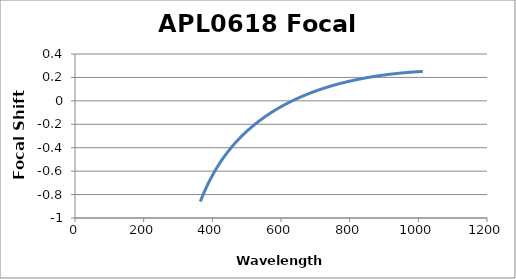
| Category | Focal Shift (mm) |
|---|---|
| 365.0 | -0.86 |
| 366.0 | -0.852 |
| 367.0 | -0.845 |
| 368.0 | -0.838 |
| 369.0 | -0.83 |
| 370.0 | -0.823 |
| 371.0 | -0.816 |
| 372.0 | -0.809 |
| 373.0 | -0.802 |
| 374.0 | -0.795 |
| 375.0 | -0.788 |
| 376.0 | -0.782 |
| 377.0 | -0.775 |
| 378.0 | -0.768 |
| 379.0 | -0.762 |
| 380.0 | -0.755 |
| 381.0 | -0.749 |
| 382.0 | -0.743 |
| 383.0 | -0.736 |
| 384.0 | -0.73 |
| 385.0 | -0.724 |
| 386.0 | -0.718 |
| 387.0 | -0.712 |
| 388.0 | -0.706 |
| 389.0 | -0.7 |
| 390.0 | -0.694 |
| 391.0 | -0.688 |
| 392.0 | -0.682 |
| 393.0 | -0.676 |
| 394.0 | -0.671 |
| 395.0 | -0.665 |
| 396.0 | -0.66 |
| 397.0 | -0.654 |
| 398.0 | -0.649 |
| 399.0 | -0.643 |
| 400.0 | -0.638 |
| 401.0 | -0.632 |
| 402.0 | -0.627 |
| 403.0 | -0.622 |
| 404.0 | -0.617 |
| 405.0 | -0.611 |
| 406.0 | -0.606 |
| 407.0 | -0.601 |
| 408.0 | -0.596 |
| 409.0 | -0.591 |
| 410.0 | -0.586 |
| 411.0 | -0.581 |
| 412.0 | -0.577 |
| 413.0 | -0.572 |
| 414.0 | -0.567 |
| 415.0 | -0.562 |
| 416.0 | -0.557 |
| 417.0 | -0.553 |
| 418.0 | -0.548 |
| 419.0 | -0.544 |
| 420.0 | -0.539 |
| 421.0 | -0.534 |
| 422.0 | -0.53 |
| 423.0 | -0.525 |
| 424.0 | -0.521 |
| 425.0 | -0.517 |
| 426.0 | -0.512 |
| 427.0 | -0.508 |
| 428.0 | -0.504 |
| 429.0 | -0.499 |
| 430.0 | -0.495 |
| 431.0 | -0.491 |
| 432.0 | -0.487 |
| 433.0 | -0.483 |
| 434.0 | -0.479 |
| 435.0 | -0.475 |
| 436.0 | -0.471 |
| 437.0 | -0.467 |
| 438.0 | -0.463 |
| 439.0 | -0.459 |
| 440.0 | -0.455 |
| 441.0 | -0.451 |
| 442.0 | -0.447 |
| 443.0 | -0.443 |
| 444.0 | -0.439 |
| 445.0 | -0.436 |
| 446.0 | -0.432 |
| 447.0 | -0.428 |
| 448.0 | -0.424 |
| 449.0 | -0.421 |
| 450.0 | -0.417 |
| 451.0 | -0.413 |
| 452.0 | -0.41 |
| 453.0 | -0.406 |
| 454.0 | -0.403 |
| 455.0 | -0.399 |
| 456.0 | -0.396 |
| 457.0 | -0.392 |
| 458.0 | -0.389 |
| 459.0 | -0.385 |
| 460.0 | -0.382 |
| 461.0 | -0.378 |
| 462.0 | -0.375 |
| 463.0 | -0.372 |
| 464.0 | -0.368 |
| 465.0 | -0.365 |
| 466.0 | -0.362 |
| 467.0 | -0.358 |
| 468.0 | -0.355 |
| 469.0 | -0.352 |
| 470.0 | -0.349 |
| 471.0 | -0.345 |
| 472.0 | -0.342 |
| 473.0 | -0.339 |
| 474.0 | -0.336 |
| 475.0 | -0.333 |
| 476.0 | -0.33 |
| 477.0 | -0.327 |
| 478.0 | -0.324 |
| 479.0 | -0.321 |
| 480.0 | -0.318 |
| 481.0 | -0.315 |
| 482.0 | -0.312 |
| 483.0 | -0.309 |
| 484.0 | -0.306 |
| 485.0 | -0.303 |
| 486.0 | -0.3 |
| 487.0 | -0.297 |
| 488.0 | -0.294 |
| 489.0 | -0.291 |
| 490.0 | -0.288 |
| 491.0 | -0.286 |
| 492.0 | -0.283 |
| 493.0 | -0.28 |
| 494.0 | -0.277 |
| 495.0 | -0.274 |
| 496.0 | -0.272 |
| 497.0 | -0.269 |
| 498.0 | -0.266 |
| 499.0 | -0.263 |
| 500.0 | -0.261 |
| 501.0 | -0.258 |
| 502.0 | -0.255 |
| 503.0 | -0.253 |
| 504.0 | -0.25 |
| 505.0 | -0.248 |
| 506.0 | -0.245 |
| 507.0 | -0.242 |
| 508.0 | -0.24 |
| 509.0 | -0.237 |
| 510.0 | -0.235 |
| 511.0 | -0.232 |
| 512.0 | -0.23 |
| 513.0 | -0.227 |
| 514.0 | -0.225 |
| 515.0 | -0.222 |
| 516.0 | -0.22 |
| 517.0 | -0.217 |
| 518.0 | -0.215 |
| 519.0 | -0.212 |
| 520.0 | -0.21 |
| 521.0 | -0.207 |
| 522.0 | -0.205 |
| 523.0 | -0.203 |
| 524.0 | -0.2 |
| 525.0 | -0.198 |
| 526.0 | -0.196 |
| 527.0 | -0.193 |
| 528.0 | -0.191 |
| 529.0 | -0.189 |
| 530.0 | -0.186 |
| 531.0 | -0.184 |
| 532.0 | -0.182 |
| 533.0 | -0.18 |
| 534.0 | -0.177 |
| 535.0 | -0.175 |
| 536.0 | -0.173 |
| 537.0 | -0.171 |
| 538.0 | -0.168 |
| 539.0 | -0.166 |
| 540.0 | -0.164 |
| 541.0 | -0.162 |
| 542.0 | -0.16 |
| 543.0 | -0.158 |
| 544.0 | -0.155 |
| 545.0 | -0.153 |
| 546.0 | -0.151 |
| 547.0 | -0.149 |
| 548.0 | -0.147 |
| 549.0 | -0.145 |
| 550.0 | -0.143 |
| 551.0 | -0.141 |
| 552.0 | -0.139 |
| 553.0 | -0.137 |
| 554.0 | -0.134 |
| 555.0 | -0.132 |
| 556.0 | -0.13 |
| 557.0 | -0.128 |
| 558.0 | -0.126 |
| 559.0 | -0.124 |
| 560.0 | -0.122 |
| 561.0 | -0.12 |
| 562.0 | -0.119 |
| 563.0 | -0.117 |
| 564.0 | -0.115 |
| 565.0 | -0.113 |
| 566.0 | -0.111 |
| 567.0 | -0.109 |
| 568.0 | -0.107 |
| 569.0 | -0.105 |
| 570.0 | -0.103 |
| 571.0 | -0.101 |
| 572.0 | -0.099 |
| 573.0 | -0.098 |
| 574.0 | -0.096 |
| 575.0 | -0.094 |
| 576.0 | -0.092 |
| 577.0 | -0.09 |
| 578.0 | -0.088 |
| 579.0 | -0.086 |
| 580.0 | -0.085 |
| 581.0 | -0.083 |
| 582.0 | -0.081 |
| 583.0 | -0.079 |
| 584.0 | -0.078 |
| 585.0 | -0.076 |
| 586.0 | -0.074 |
| 587.0 | -0.072 |
| 588.0 | -0.071 |
| 589.0 | -0.069 |
| 590.0 | -0.067 |
| 591.0 | -0.065 |
| 592.0 | -0.064 |
| 593.0 | -0.062 |
| 594.0 | -0.06 |
| 595.0 | -0.059 |
| 596.0 | -0.057 |
| 597.0 | -0.055 |
| 598.0 | -0.054 |
| 599.0 | -0.052 |
| 600.0 | -0.05 |
| 601.0 | -0.049 |
| 602.0 | -0.047 |
| 603.0 | -0.045 |
| 604.0 | -0.044 |
| 605.0 | -0.042 |
| 606.0 | -0.04 |
| 607.0 | -0.039 |
| 608.0 | -0.037 |
| 609.0 | -0.036 |
| 610.0 | -0.034 |
| 611.0 | -0.033 |
| 612.0 | -0.031 |
| 613.0 | -0.029 |
| 614.0 | -0.028 |
| 615.0 | -0.026 |
| 616.0 | -0.025 |
| 617.0 | -0.023 |
| 618.0 | -0.022 |
| 619.0 | -0.02 |
| 620.0 | -0.019 |
| 621.0 | -0.017 |
| 622.0 | -0.016 |
| 623.0 | -0.014 |
| 624.0 | -0.013 |
| 625.0 | -0.011 |
| 626.0 | -0.01 |
| 627.0 | -0.008 |
| 628.0 | -0.007 |
| 629.0 | -0.005 |
| 630.0 | -0.004 |
| 631.0 | -0.003 |
| 632.0 | -0.001 |
| 633.0 | 0 |
| 634.0 | 0.002 |
| 635.0 | 0.003 |
| 636.0 | 0.005 |
| 637.0 | 0.006 |
| 638.0 | 0.007 |
| 639.0 | 0.009 |
| 640.0 | 0.01 |
| 641.0 | 0.011 |
| 642.0 | 0.013 |
| 643.0 | 0.014 |
| 644.0 | 0.016 |
| 645.0 | 0.017 |
| 646.0 | 0.018 |
| 647.0 | 0.02 |
| 648.0 | 0.021 |
| 649.0 | 0.022 |
| 650.0 | 0.024 |
| 651.0 | 0.025 |
| 652.0 | 0.026 |
| 653.0 | 0.027 |
| 654.0 | 0.029 |
| 655.0 | 0.03 |
| 656.0 | 0.031 |
| 657.0 | 0.033 |
| 658.0 | 0.034 |
| 659.0 | 0.035 |
| 660.0 | 0.036 |
| 661.0 | 0.038 |
| 662.0 | 0.039 |
| 663.0 | 0.04 |
| 664.0 | 0.041 |
| 665.0 | 0.043 |
| 666.0 | 0.044 |
| 667.0 | 0.045 |
| 668.0 | 0.046 |
| 669.0 | 0.048 |
| 670.0 | 0.049 |
| 671.0 | 0.05 |
| 672.0 | 0.051 |
| 673.0 | 0.052 |
| 674.0 | 0.054 |
| 675.0 | 0.055 |
| 676.0 | 0.056 |
| 677.0 | 0.057 |
| 678.0 | 0.058 |
| 679.0 | 0.059 |
| 680.0 | 0.061 |
| 681.0 | 0.062 |
| 682.0 | 0.063 |
| 683.0 | 0.064 |
| 684.0 | 0.065 |
| 685.0 | 0.066 |
| 686.0 | 0.067 |
| 687.0 | 0.069 |
| 688.0 | 0.07 |
| 689.0 | 0.071 |
| 690.0 | 0.072 |
| 691.0 | 0.073 |
| 692.0 | 0.074 |
| 693.0 | 0.075 |
| 694.0 | 0.076 |
| 695.0 | 0.077 |
| 696.0 | 0.079 |
| 697.0 | 0.08 |
| 698.0 | 0.081 |
| 699.0 | 0.082 |
| 700.0 | 0.083 |
| 701.0 | 0.084 |
| 702.0 | 0.085 |
| 703.0 | 0.086 |
| 704.0 | 0.087 |
| 705.0 | 0.088 |
| 706.0 | 0.089 |
| 707.0 | 0.09 |
| 708.0 | 0.091 |
| 709.0 | 0.092 |
| 710.0 | 0.093 |
| 711.0 | 0.094 |
| 712.0 | 0.095 |
| 713.0 | 0.096 |
| 714.0 | 0.097 |
| 715.0 | 0.098 |
| 716.0 | 0.099 |
| 717.0 | 0.1 |
| 718.0 | 0.101 |
| 719.0 | 0.102 |
| 720.0 | 0.103 |
| 721.0 | 0.104 |
| 722.0 | 0.105 |
| 723.0 | 0.106 |
| 724.0 | 0.107 |
| 725.0 | 0.108 |
| 726.0 | 0.109 |
| 727.0 | 0.11 |
| 728.0 | 0.111 |
| 729.0 | 0.112 |
| 730.0 | 0.113 |
| 731.0 | 0.113 |
| 732.0 | 0.114 |
| 733.0 | 0.115 |
| 734.0 | 0.116 |
| 735.0 | 0.117 |
| 736.0 | 0.118 |
| 737.0 | 0.119 |
| 738.0 | 0.12 |
| 739.0 | 0.121 |
| 740.0 | 0.122 |
| 741.0 | 0.122 |
| 742.0 | 0.123 |
| 743.0 | 0.124 |
| 744.0 | 0.125 |
| 745.0 | 0.126 |
| 746.0 | 0.127 |
| 747.0 | 0.128 |
| 748.0 | 0.129 |
| 749.0 | 0.129 |
| 750.0 | 0.13 |
| 751.0 | 0.131 |
| 752.0 | 0.132 |
| 753.0 | 0.133 |
| 754.0 | 0.134 |
| 755.0 | 0.134 |
| 756.0 | 0.135 |
| 757.0 | 0.136 |
| 758.0 | 0.137 |
| 759.0 | 0.138 |
| 760.0 | 0.139 |
| 761.0 | 0.139 |
| 762.0 | 0.14 |
| 763.0 | 0.141 |
| 764.0 | 0.142 |
| 765.0 | 0.143 |
| 766.0 | 0.143 |
| 767.0 | 0.144 |
| 768.0 | 0.145 |
| 769.0 | 0.146 |
| 770.0 | 0.146 |
| 771.0 | 0.147 |
| 772.0 | 0.148 |
| 773.0 | 0.149 |
| 774.0 | 0.15 |
| 775.0 | 0.15 |
| 776.0 | 0.151 |
| 777.0 | 0.152 |
| 778.0 | 0.153 |
| 779.0 | 0.153 |
| 780.0 | 0.154 |
| 781.0 | 0.155 |
| 782.0 | 0.155 |
| 783.0 | 0.156 |
| 784.0 | 0.157 |
| 785.0 | 0.158 |
| 786.0 | 0.158 |
| 787.0 | 0.159 |
| 788.0 | 0.16 |
| 789.0 | 0.16 |
| 790.0 | 0.161 |
| 791.0 | 0.162 |
| 792.0 | 0.163 |
| 793.0 | 0.163 |
| 794.0 | 0.164 |
| 795.0 | 0.165 |
| 796.0 | 0.165 |
| 797.0 | 0.166 |
| 798.0 | 0.167 |
| 799.0 | 0.167 |
| 800.0 | 0.168 |
| 801.0 | 0.169 |
| 802.0 | 0.169 |
| 803.0 | 0.17 |
| 804.0 | 0.171 |
| 805.0 | 0.171 |
| 806.0 | 0.172 |
| 807.0 | 0.173 |
| 808.0 | 0.173 |
| 809.0 | 0.174 |
| 810.0 | 0.175 |
| 811.0 | 0.175 |
| 812.0 | 0.176 |
| 813.0 | 0.177 |
| 814.0 | 0.177 |
| 815.0 | 0.178 |
| 816.0 | 0.178 |
| 817.0 | 0.179 |
| 818.0 | 0.18 |
| 819.0 | 0.18 |
| 820.0 | 0.181 |
| 821.0 | 0.181 |
| 822.0 | 0.182 |
| 823.0 | 0.183 |
| 824.0 | 0.183 |
| 825.0 | 0.184 |
| 826.0 | 0.184 |
| 827.0 | 0.185 |
| 828.0 | 0.186 |
| 829.0 | 0.186 |
| 830.0 | 0.187 |
| 831.0 | 0.187 |
| 832.0 | 0.188 |
| 833.0 | 0.188 |
| 834.0 | 0.189 |
| 835.0 | 0.19 |
| 836.0 | 0.19 |
| 837.0 | 0.191 |
| 838.0 | 0.191 |
| 839.0 | 0.192 |
| 840.0 | 0.192 |
| 841.0 | 0.193 |
| 842.0 | 0.193 |
| 843.0 | 0.194 |
| 844.0 | 0.195 |
| 845.0 | 0.195 |
| 846.0 | 0.196 |
| 847.0 | 0.196 |
| 848.0 | 0.197 |
| 849.0 | 0.197 |
| 850.0 | 0.198 |
| 851.0 | 0.198 |
| 852.0 | 0.199 |
| 853.0 | 0.199 |
| 854.0 | 0.2 |
| 855.0 | 0.2 |
| 856.0 | 0.201 |
| 857.0 | 0.201 |
| 858.0 | 0.202 |
| 859.0 | 0.202 |
| 860.0 | 0.203 |
| 861.0 | 0.203 |
| 862.0 | 0.204 |
| 863.0 | 0.204 |
| 864.0 | 0.205 |
| 865.0 | 0.205 |
| 866.0 | 0.206 |
| 867.0 | 0.206 |
| 868.0 | 0.207 |
| 869.0 | 0.207 |
| 870.0 | 0.208 |
| 871.0 | 0.208 |
| 872.0 | 0.209 |
| 873.0 | 0.209 |
| 874.0 | 0.209 |
| 875.0 | 0.21 |
| 876.0 | 0.21 |
| 877.0 | 0.211 |
| 878.0 | 0.211 |
| 879.0 | 0.212 |
| 880.0 | 0.212 |
| 881.0 | 0.213 |
| 882.0 | 0.213 |
| 883.0 | 0.213 |
| 884.0 | 0.214 |
| 885.0 | 0.214 |
| 886.0 | 0.215 |
| 887.0 | 0.215 |
| 888.0 | 0.216 |
| 889.0 | 0.216 |
| 890.0 | 0.216 |
| 891.0 | 0.217 |
| 892.0 | 0.217 |
| 893.0 | 0.218 |
| 894.0 | 0.218 |
| 895.0 | 0.219 |
| 896.0 | 0.219 |
| 897.0 | 0.219 |
| 898.0 | 0.22 |
| 899.0 | 0.22 |
| 900.0 | 0.221 |
| 901.0 | 0.221 |
| 902.0 | 0.221 |
| 903.0 | 0.222 |
| 904.0 | 0.222 |
| 905.0 | 0.222 |
| 906.0 | 0.223 |
| 907.0 | 0.223 |
| 908.0 | 0.224 |
| 909.0 | 0.224 |
| 910.0 | 0.224 |
| 911.0 | 0.225 |
| 912.0 | 0.225 |
| 913.0 | 0.225 |
| 914.0 | 0.226 |
| 915.0 | 0.226 |
| 916.0 | 0.227 |
| 917.0 | 0.227 |
| 918.0 | 0.227 |
| 919.0 | 0.228 |
| 920.0 | 0.228 |
| 921.0 | 0.228 |
| 922.0 | 0.229 |
| 923.0 | 0.229 |
| 924.0 | 0.229 |
| 925.0 | 0.23 |
| 926.0 | 0.23 |
| 927.0 | 0.23 |
| 928.0 | 0.231 |
| 929.0 | 0.231 |
| 930.0 | 0.231 |
| 931.0 | 0.232 |
| 932.0 | 0.232 |
| 933.0 | 0.232 |
| 934.0 | 0.233 |
| 935.0 | 0.233 |
| 936.0 | 0.233 |
| 937.0 | 0.234 |
| 938.0 | 0.234 |
| 939.0 | 0.234 |
| 940.0 | 0.234 |
| 941.0 | 0.235 |
| 942.0 | 0.235 |
| 943.0 | 0.235 |
| 944.0 | 0.236 |
| 945.0 | 0.236 |
| 946.0 | 0.236 |
| 947.0 | 0.237 |
| 948.0 | 0.237 |
| 949.0 | 0.237 |
| 950.0 | 0.237 |
| 951.0 | 0.238 |
| 952.0 | 0.238 |
| 953.0 | 0.238 |
| 954.0 | 0.239 |
| 955.0 | 0.239 |
| 956.0 | 0.239 |
| 957.0 | 0.239 |
| 958.0 | 0.24 |
| 959.0 | 0.24 |
| 960.0 | 0.24 |
| 961.0 | 0.24 |
| 962.0 | 0.241 |
| 963.0 | 0.241 |
| 964.0 | 0.241 |
| 965.0 | 0.241 |
| 966.0 | 0.242 |
| 967.0 | 0.242 |
| 968.0 | 0.242 |
| 969.0 | 0.242 |
| 970.0 | 0.243 |
| 971.0 | 0.243 |
| 972.0 | 0.243 |
| 973.0 | 0.243 |
| 974.0 | 0.244 |
| 975.0 | 0.244 |
| 976.0 | 0.244 |
| 977.0 | 0.244 |
| 978.0 | 0.245 |
| 979.0 | 0.245 |
| 980.0 | 0.245 |
| 981.0 | 0.245 |
| 982.0 | 0.246 |
| 983.0 | 0.246 |
| 984.0 | 0.246 |
| 985.0 | 0.246 |
| 986.0 | 0.246 |
| 987.0 | 0.247 |
| 988.0 | 0.247 |
| 989.0 | 0.247 |
| 990.0 | 0.247 |
| 991.0 | 0.247 |
| 992.0 | 0.248 |
| 993.0 | 0.248 |
| 994.0 | 0.248 |
| 995.0 | 0.248 |
| 996.0 | 0.248 |
| 997.0 | 0.249 |
| 998.0 | 0.249 |
| 999.0 | 0.249 |
| 1000.0 | 0.249 |
| 1001.0 | 0.249 |
| 1002.0 | 0.25 |
| 1003.0 | 0.25 |
| 1004.0 | 0.25 |
| 1005.0 | 0.25 |
| 1006.0 | 0.25 |
| 1007.0 | 0.25 |
| 1008.0 | 0.251 |
| 1009.0 | 0.251 |
| 1010.0 | 0.251 |
| 1011.0 | 0.251 |
| 1012.0 | 0.251 |
| 1013.0 | 0.251 |